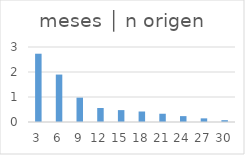
| Category | meses │ n origen |
|---|---|
| 3.0 | 2.731 |
| 6.0 | 1.897 |
| 9.0 | 0.974 |
| 12.0 | 0.56 |
| 15.0 | 0.476 |
| 18.0 | 0.42 |
| 21.0 | 0.33 |
| 24.0 | 0.235 |
| 27.0 | 0.146 |
| 30.0 | 0.073 |